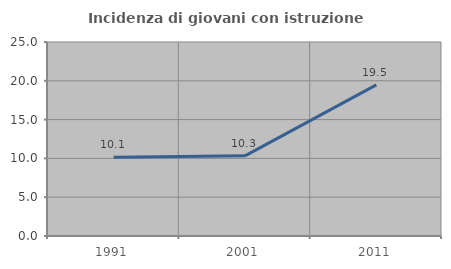
| Category | Incidenza di giovani con istruzione universitaria |
|---|---|
| 1991.0 | 10.145 |
| 2001.0 | 10.331 |
| 2011.0 | 19.474 |